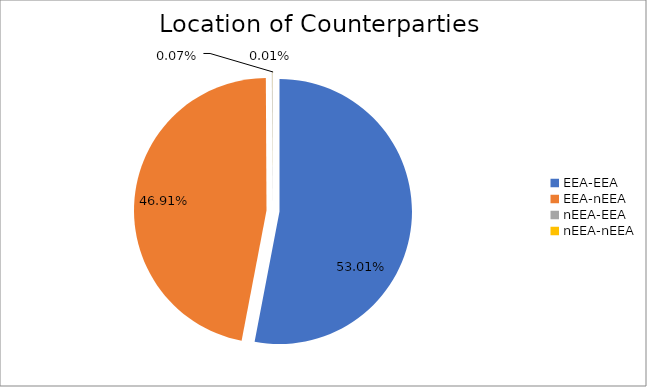
| Category | Series 0 |
|---|---|
| EEA-EEA | 7493996.858 |
| EEA-nEEA | 6631924.746 |
| nEEA-EEA | 9484.669 |
| nEEA-nEEA | 1806.644 |